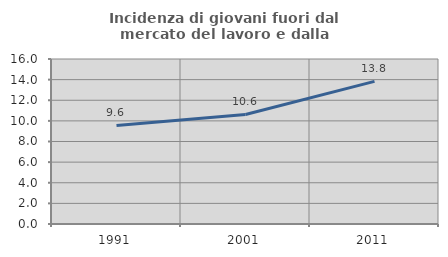
| Category | Incidenza di giovani fuori dal mercato del lavoro e dalla formazione  |
|---|---|
| 1991.0 | 9.556 |
| 2001.0 | 10.621 |
| 2011.0 | 13.828 |